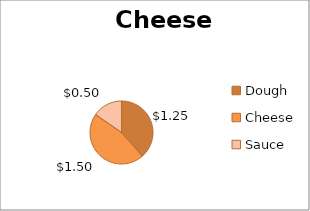
| Category | Cheese |
|---|---|
| Dough | 1.25 |
| Cheese | 1.5 |
| Sauce | 0.5 |